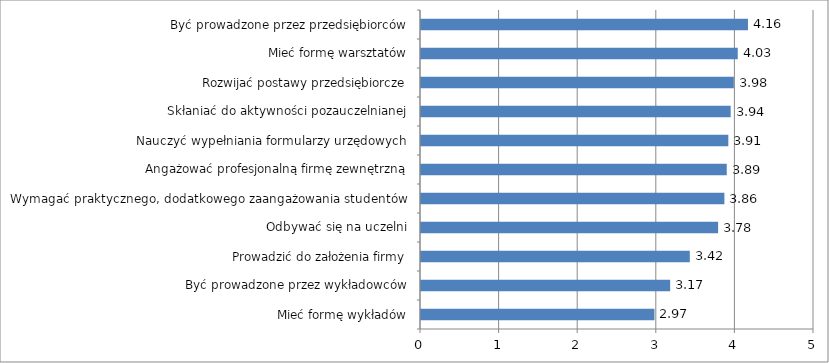
| Category | wartość |
|---|---|
| Mieć formę wykładów | 2.97 |
| Być prowadzone przez wykładowców | 3.17 |
| Prowadzić do założenia firmy | 3.42 |
| Odbywać się na uczelni | 3.78 |
| Wymagać praktycznego, dodatkowego zaangażowania studentów | 3.86 |
| Angażować profesjonalną firmę zewnętrzną | 3.89 |
| Nauczyć wypełniania formularzy urzędowych | 3.91 |
| Skłaniać do aktywności pozauczelnianej | 3.94 |
| Rozwijać postawy przedsiębiorcze | 3.98 |
| Mieć formę warsztatów | 4.03 |
| Być prowadzone przez przedsiębiorców | 4.16 |